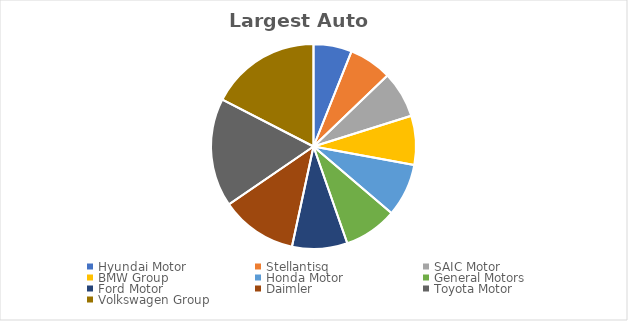
| Category | Series 0 |
|---|---|
| Hyundai Motor | 88.1 |
| Stellantisq | 98.8 |
| SAIC Motor | 106.7 |
| BMW Group | 112.8 |
| Honda Motor | 121.8 |
| General Motors | 122.5 |
| Ford Motor | 127.1 |
| Daimler | 175.9 |
| Toyota Motor | 249.4 |
| Volkswagen Group | 254.1 |